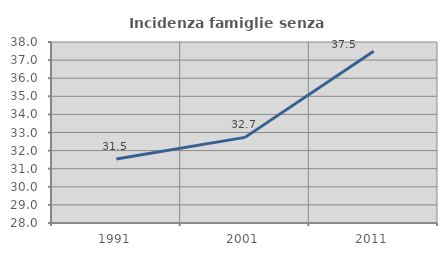
| Category | Incidenza famiglie senza nuclei |
|---|---|
| 1991.0 | 31.532 |
| 2001.0 | 32.731 |
| 2011.0 | 37.489 |